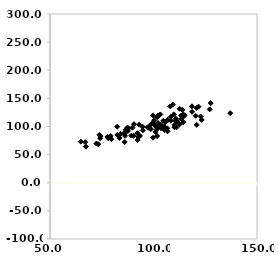
| Category | Series 0 |
|---|---|
| 108.41171285572518 | 110.428 |
| 82.44847405165152 | 99.662 |
| 120.38512033823292 | 118.818 |
| 94.81167459533594 | 99.257 |
| 93.10398095881877 | 103.207 |
| 111.30704400334045 | 108.633 |
| 74.2412678839492 | 79.187 |
| 86.9972689979187 | 92.577 |
| 106.62565276824243 | 96.817 |
| 73.85639113004848 | 84.991 |
| 99.80065196628233 | 119.739 |
| 86.59135093705413 | 94.041 |
| 110.70219514264939 | 110.682 |
| 105.82199079477617 | 107.807 |
| 87.38072122140157 | 98.093 |
| 77.84869201340064 | 81.65 |
| 127.6404685276533 | 141.697 |
| 118.57713422540658 | 135.904 |
| 90.40571048421013 | 83.398 |
| 120.84170454391447 | 132.861 |
| 103.59564807269737 | 97.004 |
| 123.30339112059798 | 111.663 |
| 97.1228206743444 | 98.363 |
| 103.29410723246235 | 121.487 |
| 86.09619522145114 | 88.277 |
| 89.28779987476001 | 83.771 |
| 114.50795890596771 | 118.051 |
| 101.33439726005543 | 102.925 |
| 122.78275685787524 | 117.723 |
| 110.6725449045704 | 109.464 |
| 74.37615830352331 | 82.954 |
| 101.43353000922359 | 93.954 |
| 86.1676402792709 | 89.403 |
| 98.74129918808211 | 95.456 |
| 92.22027725859498 | 88.119 |
| 67.34632620986034 | 64.162 |
| 100.953615184321 | 90.167 |
| 64.90692333755484 | 73.081 |
| 79.30983101659356 | 83.14 |
| 79.62717587232197 | 77.524 |
| 97.57506123409658 | 97.728 |
| 103.58605553672211 | 103.1 |
| 99.53235337020223 | 105.873 |
| 105.31836606194922 | 93.413 |
| 108.13551869654471 | 135.734 |
| 105.40179381082267 | 99.136 |
| 93.48415724667888 | 83.238 |
| 101.84748887940819 | 116.572 |
| 98.62078436579225 | 103.336 |
| 137.05869524438148 | 123.746 |
| 127.15393321192289 | 130.482 |
| 82.56982895762505 | 85.263 |
| 118.64863761944727 | 126.113 |
| 113.34527240153291 | 119.346 |
| 101.73273877607744 | 83.066 |
| 113.48359528958673 | 113.665 |
| 87.62672452454403 | 92.084 |
| 102.13858273040931 | 106.308 |
| 105.08739437533237 | 99.705 |
| 109.37648100836766 | 138.784 |
| 90.57132311752034 | 104.161 |
| 114.94027696744122 | 119.742 |
| 108.38788407282637 | 117.498 |
| 83.58716928693012 | 79.627 |
| 121.76374692471602 | 135.27 |
| 110.1023111544465 | 98.599 |
| 99.78972681790084 | 80.103 |
| 89.79744448239249 | 97.878 |
| 73.28319915167033 | 68.583 |
| 106.87758729303279 | 111.986 |
| 100.31548201485053 | 111.218 |
| 114.4378958194302 | 107.526 |
| 86.258949536459 | 83.397 |
| 120.86368401292417 | 102.849 |
| 110.04151186953635 | 102.652 |
| 113.92430383156457 | 129.563 |
| 84.0799922907017 | 86.994 |
| 100.70411310566557 | 101.431 |
| 110.78843954085603 | 113.962 |
| 87.94537956285765 | 96.767 |
| 112.66128413603849 | 104.092 |
| 111.12324795039012 | 98.549 |
| 92.72990140544559 | 81.177 |
| 92.30504488806538 | 75.898 |
| 86.0876008462689 | 72.454 |
| 72.41811969055362 | 69.727 |
| 102.63537881629053 | 100.046 |
| 104.70631201043645 | 110.103 |
| 67.0032882327059 | 72.093 |
| 114.40679527434463 | 121.547 |
| 94.80961991111555 | 93.051 |
| 101.99276103926331 | 118.928 |
| 101.27026980628816 | 99.773 |
| 106.74835390317844 | 91.477 |
| 111.32385137077078 | 109.937 |
| 78.09144848418028 | 79.516 |
| 112.62598918680445 | 131.436 |
| 110.8420653057539 | 110.462 |
| 109.86011535889442 | 121.645 |
| 99.68066775213367 | 105.263 |